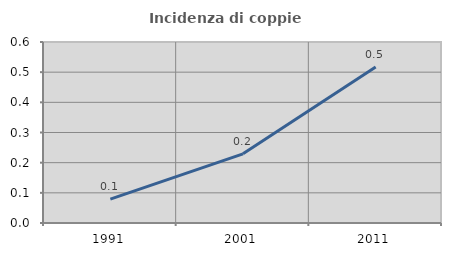
| Category | Incidenza di coppie miste |
|---|---|
| 1991.0 | 0.079 |
| 2001.0 | 0.229 |
| 2011.0 | 0.517 |